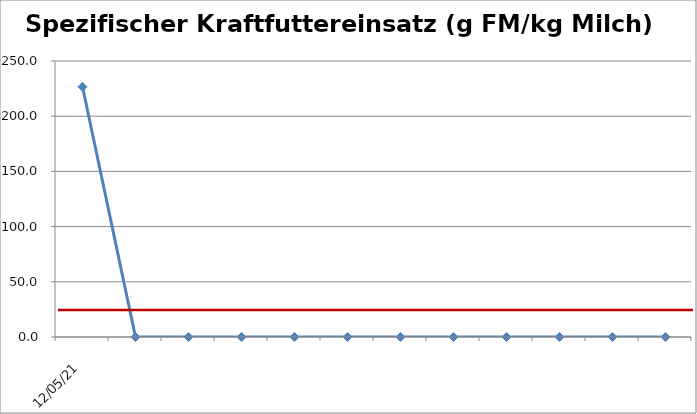
| Category | Spezifischer Kraftfuttereinsatz (g FM/kg Milch) |
|---|---|
| 12.05.21 | 226.642 |
|    | 0 |
|    | 0 |
|    | 0 |
|    | 0 |
|    | 0 |
|    | 0 |
|    | 0 |
|    | 0 |
|    | 0 |
|    | 0 |
|    | 0 |